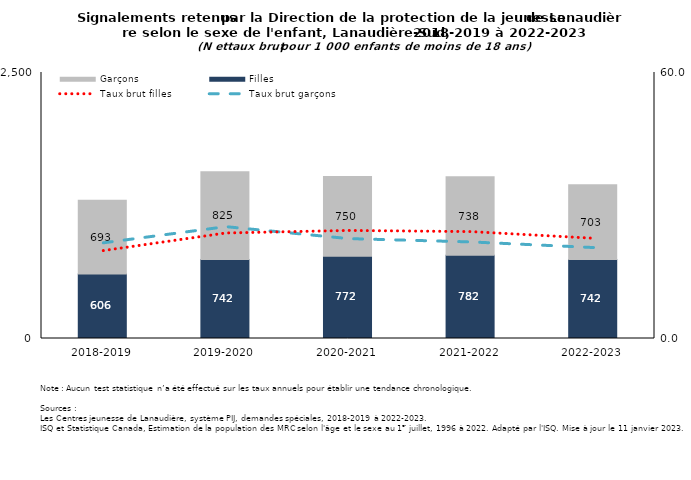
| Category | Filles | Garçons |
|---|---|---|
| 2018-2019 | 606 | 693 |
| 2019-2020 | 742 | 825 |
| 2020-2021 | 772 | 750 |
| 2021-2022 | 782 | 738 |
| 2022-2023 | 742 | 703 |